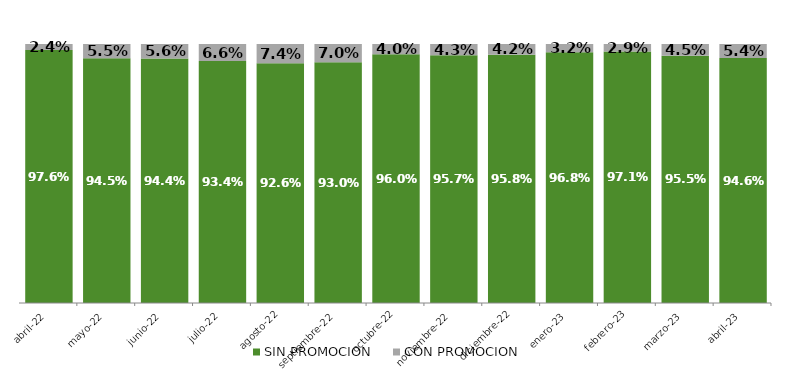
| Category | SIN PROMOCION   | CON PROMOCION   |
|---|---|---|
| 2022-04-01 | 0.976 | 0.024 |
| 2022-05-01 | 0.945 | 0.055 |
| 2022-06-01 | 0.944 | 0.056 |
| 2022-07-01 | 0.934 | 0.066 |
| 2022-08-01 | 0.926 | 0.074 |
| 2022-09-01 | 0.93 | 0.07 |
| 2022-10-01 | 0.96 | 0.04 |
| 2022-11-01 | 0.957 | 0.043 |
| 2022-12-01 | 0.958 | 0.042 |
| 2023-01-01 | 0.968 | 0.032 |
| 2023-02-01 | 0.971 | 0.029 |
| 2023-03-01 | 0.955 | 0.045 |
| 2023-04-01 | 0.946 | 0.054 |